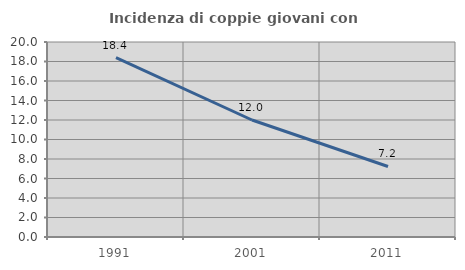
| Category | Incidenza di coppie giovani con figli |
|---|---|
| 1991.0 | 18.398 |
| 2001.0 | 12 |
| 2011.0 | 7.233 |